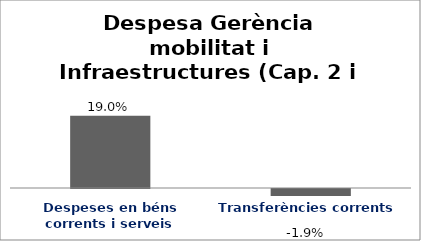
| Category | Series 0 |
|---|---|
| Despeses en béns corrents i serveis | 0.19 |
| Transferències corrents | -0.019 |